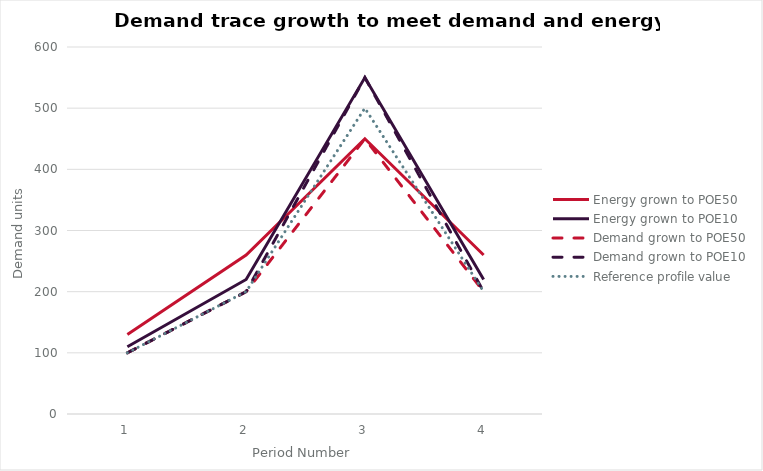
| Category | Energy grown to POE50 | Energy grown to POE10 | Demand grown to POE50 | Demand grown to POE10 | Reference profile value |
|---|---|---|---|---|---|
| 0 | 130 | 110 | 100 | 100 | 100 |
| 1 | 260 | 220 | 200 | 200 | 200 |
| 2 | 450 | 550 | 450 | 550 | 500 |
| 3 | 260 | 220 | 200 | 200 | 200 |